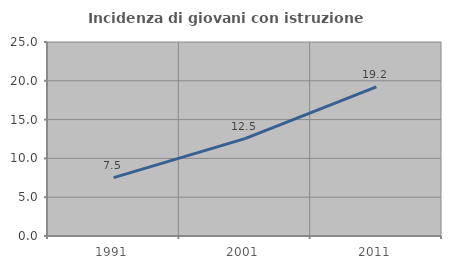
| Category | Incidenza di giovani con istruzione universitaria |
|---|---|
| 1991.0 | 7.517 |
| 2001.0 | 12.549 |
| 2011.0 | 19.208 |